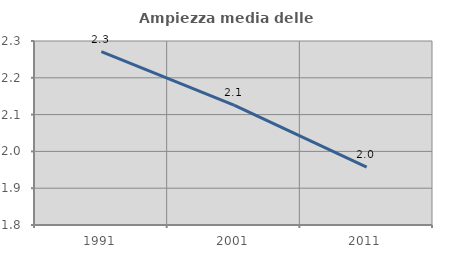
| Category | Ampiezza media delle famiglie |
|---|---|
| 1991.0 | 2.271 |
| 2001.0 | 2.126 |
| 2011.0 | 1.957 |